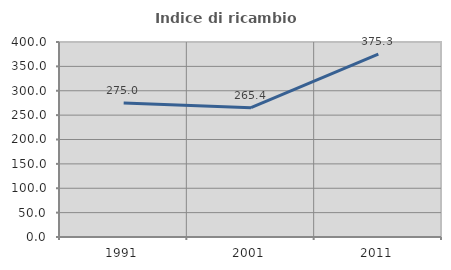
| Category | Indice di ricambio occupazionale  |
|---|---|
| 1991.0 | 275 |
| 2001.0 | 265.354 |
| 2011.0 | 375.294 |